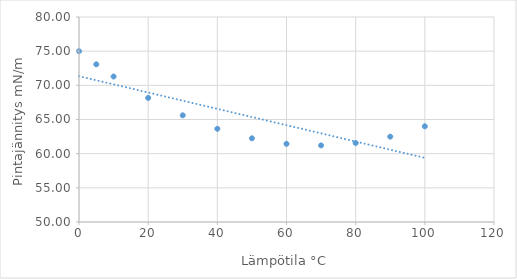
| Category | Series 0 |
|---|---|
| 0.0 | 75 |
| 5.0 | 73.072 |
| 10.0 | 71.29 |
| 20.0 | 68.16 |
| 30.0 | 65.61 |
| 40.0 | 63.64 |
| 50.0 | 62.25 |
| 60.0 | 61.44 |
| 70.0 | 61.21 |
| 80.0 | 61.56 |
| 90.0 | 62.49 |
| 100.0 | 64 |